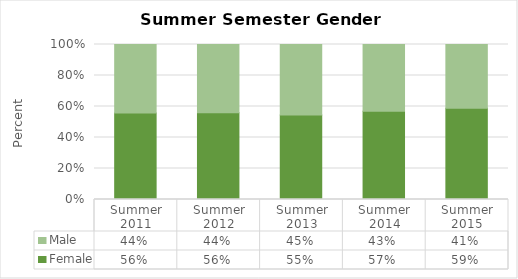
| Category | Female | Male |
|---|---|---|
| Summer 2011 | 0.558 | 0.442 |
| Summer 2012 | 0.56 | 0.44 |
| Summer 2013 | 0.545 | 0.455 |
| Summer 2014 | 0.57 | 0.43 |
| Summer 2015 | 0.588 | 0.412 |